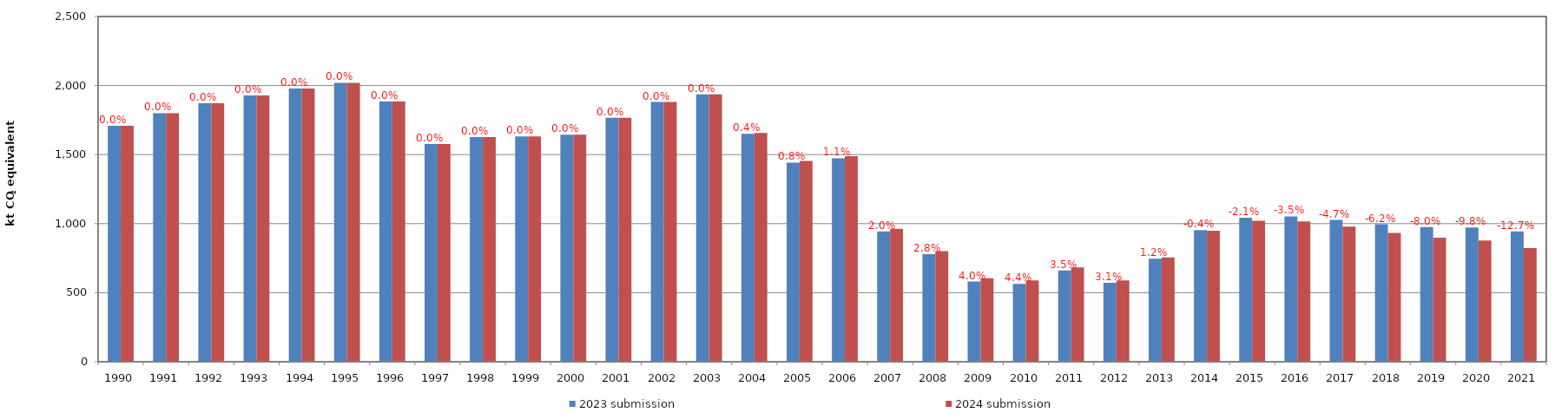
| Category | 2023 submission | 2024 submission |
|---|---|---|
| 1990.0 | 1709.238 | 1709.238 |
| 1991.0 | 1799.726 | 1799.726 |
| 1992.0 | 1872.611 | 1872.611 |
| 1993.0 | 1928.635 | 1928.635 |
| 1994.0 | 1978.886 | 1978.886 |
| 1995.0 | 2019.761 | 2019.761 |
| 1996.0 | 1884.463 | 1884.463 |
| 1997.0 | 1577.081 | 1577.081 |
| 1998.0 | 1626.696 | 1626.696 |
| 1999.0 | 1630.862 | 1630.862 |
| 2000.0 | 1643.385 | 1643.385 |
| 2001.0 | 1766.968 | 1766.968 |
| 2002.0 | 1880.98 | 1880.98 |
| 2003.0 | 1935.886 | 1935.886 |
| 2004.0 | 1650.017 | 1656.808 |
| 2005.0 | 1442.324 | 1454.386 |
| 2006.0 | 1473.044 | 1489.176 |
| 2007.0 | 943.257 | 962.504 |
| 2008.0 | 778.749 | 800.356 |
| 2009.0 | 580.613 | 603.975 |
| 2010.0 | 564.238 | 588.875 |
| 2011.0 | 660.895 | 683.73 |
| 2012.0 | 572.033 | 589.557 |
| 2013.0 | 745.875 | 755.059 |
| 2014.0 | 953.399 | 949.246 |
| 2015.0 | 1042.053 | 1020.433 |
| 2016.0 | 1052.212 | 1015.891 |
| 2017.0 | 1027 | 978.972 |
| 2018.0 | 995.143 | 933.276 |
| 2019.0 | 975.669 | 897.945 |
| 2020.0 | 972.792 | 877.829 |
| 2021.0 | 943.362 | 823.427 |